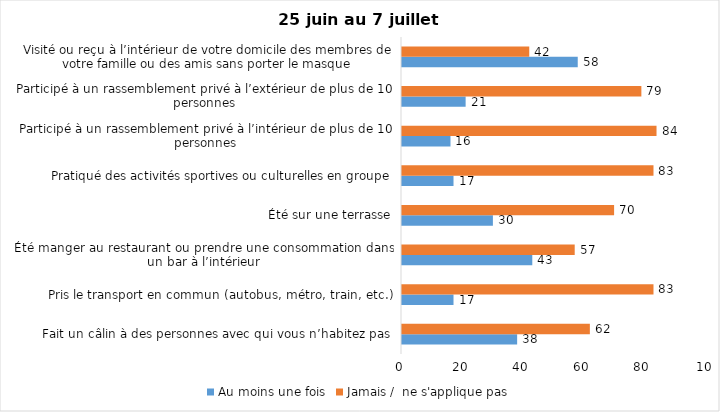
| Category | Au moins une fois | Jamais /  ne s'applique pas |
|---|---|---|
| Fait un câlin à des personnes avec qui vous n’habitez pas | 38 | 62 |
| Pris le transport en commun (autobus, métro, train, etc.) | 17 | 83 |
| Été manger au restaurant ou prendre une consommation dans un bar à l’intérieur | 43 | 57 |
| Été sur une terrasse | 30 | 70 |
| Pratiqué des activités sportives ou culturelles en groupe | 17 | 83 |
| Participé à un rassemblement privé à l’intérieur de plus de 10 personnes | 16 | 84 |
| Participé à un rassemblement privé à l’extérieur de plus de 10 personnes | 21 | 79 |
| Visité ou reçu à l’intérieur de votre domicile des membres de votre famille ou des amis sans porter le masque | 58 | 42 |